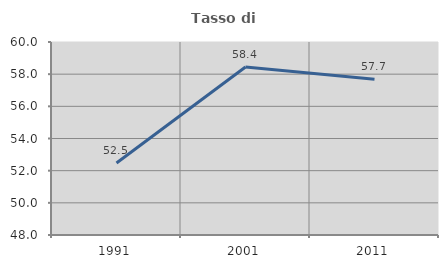
| Category | Tasso di occupazione   |
|---|---|
| 1991.0 | 52.48 |
| 2001.0 | 58.443 |
| 2011.0 | 57.677 |